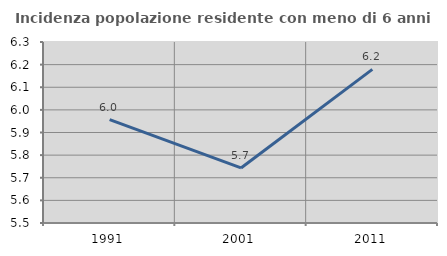
| Category | Incidenza popolazione residente con meno di 6 anni |
|---|---|
| 1991.0 | 5.957 |
| 2001.0 | 5.743 |
| 2011.0 | 6.179 |